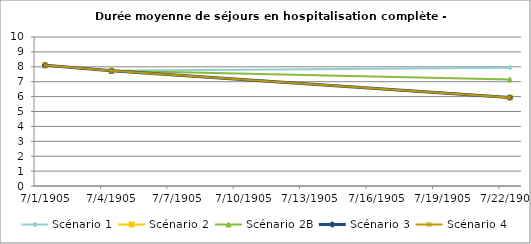
| Category | Scénario 1 | Scénario 2 | Scénario 2B | Scénario 3 | Scénario 4 |
|---|---|---|---|---|---|
| 2009.0 | 8.105 | 8.105 | 8.105 | 8.105 | 8.105 |
| 2012.0 | 7.732 | 7.732 | 7.732 | 7.732 | 7.732 |
| 2030.0 | 7.941 | 5.934 | 7.149 | 5.934 | 5.932 |